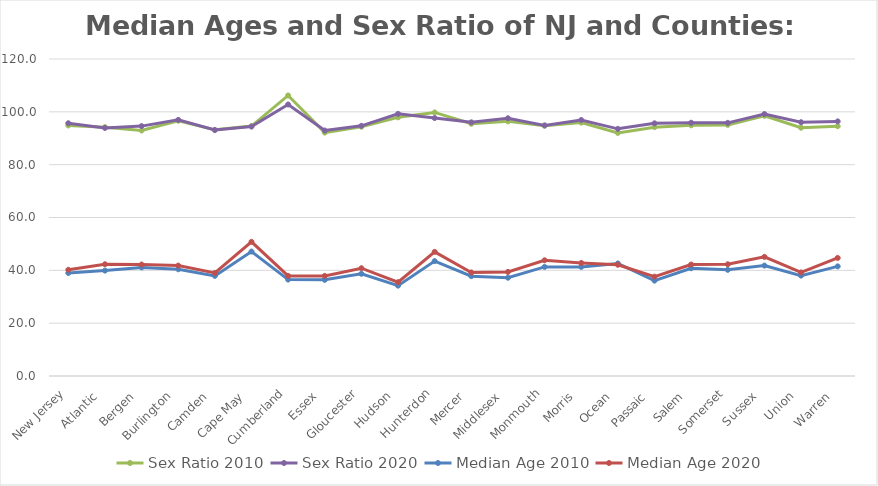
| Category | Sex Ratio 2010 | Sex Ratio 2020 | Median Age 2010 | Median Age 2020 |
|---|---|---|---|---|
| New Jersey | 94.843 | 95.676 | 39 | 40.2 |
| Atlantic  | 94.2 | 93.909 | 39.9 | 42.3 |
| Bergen  | 92.925 | 94.598 | 41.1 | 42.2 |
| Burlington  | 96.641 | 96.949 | 40.4 | 41.8 |
| Camden  | 93.178 | 93.102 | 37.9 | 39 |
| Cape May  | 94.616 | 94.415 | 47.1 | 50.8 |
| Cumberland | 106.201 | 102.781 | 36.5 | 37.9 |
| Essex  | 92.147 | 92.922 | 36.4 | 37.9 |
| Gloucester | 94.37 | 94.71 | 38.7 | 40.8 |
| Hudson  | 97.912 | 99.232 | 34.2 | 35.5 |
| Hunterdon | 99.777 | 97.645 | 43.5 | 47 |
| Mercer  | 95.494 | 96.023 | 37.8 | 39.2 |
| Middlesex  | 96.39 | 97.573 | 37.2 | 39.4 |
| Monmouth | 94.726 | 94.873 | 41.3 | 43.8 |
| Morris  | 95.928 | 96.901 | 41.3 | 42.8 |
| Ocean  | 92.019 | 93.56 | 42.6 | 42.1 |
| Passaic  | 94.197 | 95.649 | 36.1 | 37.6 |
| Salem  | 94.906 | 95.869 | 40.8 | 42.2 |
| Somerset | 95.057 | 95.829 | 40.2 | 42.3 |
| Sussex  | 98.504 | 99.164 | 41.8 | 45.1 |
| Union  | 93.985 | 96.062 | 38 | 39.2 |
| Warren  | 94.565 | 96.386 | 41.5 | 44.7 |